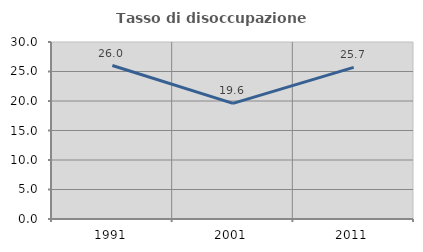
| Category | Tasso di disoccupazione giovanile  |
|---|---|
| 1991.0 | 26.015 |
| 2001.0 | 19.59 |
| 2011.0 | 25.691 |